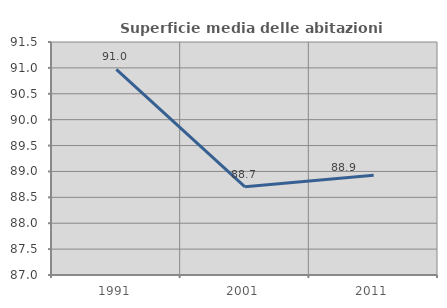
| Category | Superficie media delle abitazioni occupate |
|---|---|
| 1991.0 | 90.97 |
| 2001.0 | 88.702 |
| 2011.0 | 88.929 |